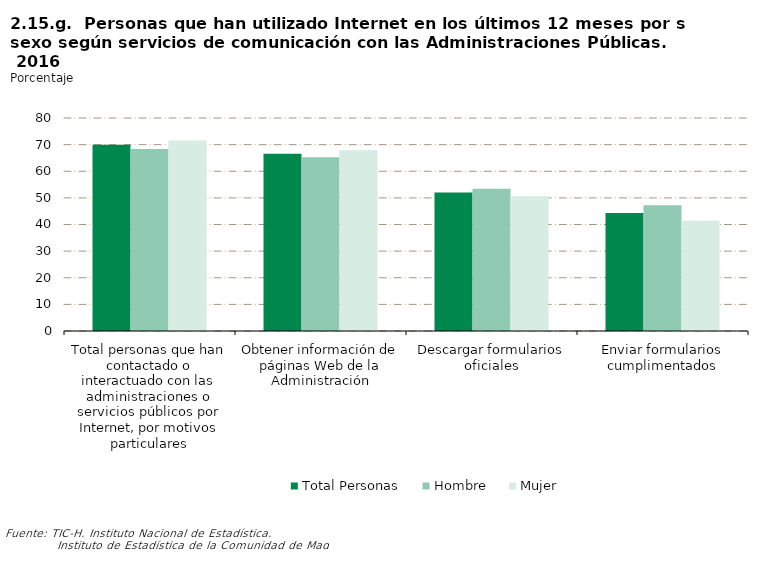
| Category | Total Personas | Hombre | Mujer |
|---|---|---|---|
| Total personas que han contactado o interactuado con las administraciones o servicios públicos por Internet, por motivos particulares | 69.916 | 68.322 | 71.506 |
| Obtener información de páginas Web de la Administración | 66.582 | 65.281 | 67.881 |
| Descargar formularios oficiales | 52.023 | 53.419 | 50.63 |
| Enviar formularios cumplimentados | 44.292 | 47.208 | 41.38 |